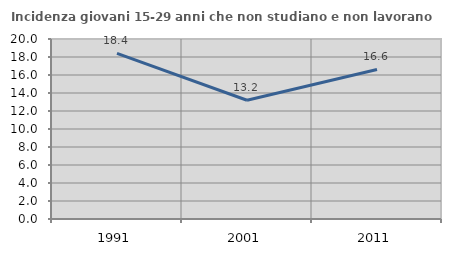
| Category | Incidenza giovani 15-29 anni che non studiano e non lavorano  |
|---|---|
| 1991.0 | 18.396 |
| 2001.0 | 13.194 |
| 2011.0 | 16.617 |